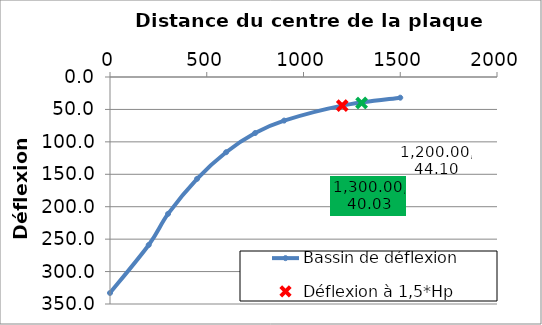
| Category | Bassin de déflexion |
|---|---|
| 0.0 | 333 |
| 200.0 | 259 |
| 300.0 | 211 |
| 450.0 | 157 |
| 600.0 | 116 |
| 750.0 | 86.4 |
| 900.0 | 67.2 |
| 1200.0 | 44.1 |
| 1500.0 | 31.9 |